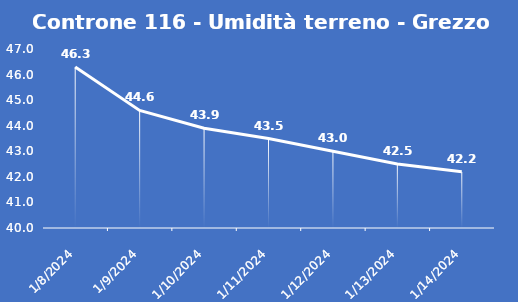
| Category | Controne 116 - Umidità terreno - Grezzo (%VWC) |
|---|---|
| 1/8/24 | 46.3 |
| 1/9/24 | 44.6 |
| 1/10/24 | 43.9 |
| 1/11/24 | 43.5 |
| 1/12/24 | 43 |
| 1/13/24 | 42.5 |
| 1/14/24 | 42.2 |